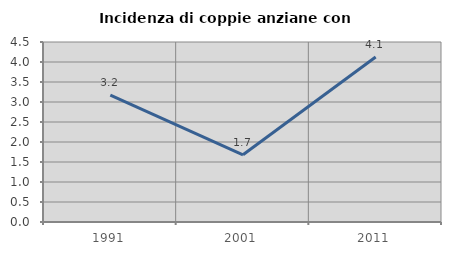
| Category | Incidenza di coppie anziane con figli |
|---|---|
| 1991.0 | 3.175 |
| 2001.0 | 1.681 |
| 2011.0 | 4.124 |